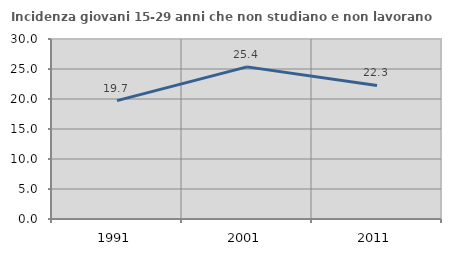
| Category | Incidenza giovani 15-29 anni che non studiano e non lavorano  |
|---|---|
| 1991.0 | 19.733 |
| 2001.0 | 25.356 |
| 2011.0 | 22.252 |